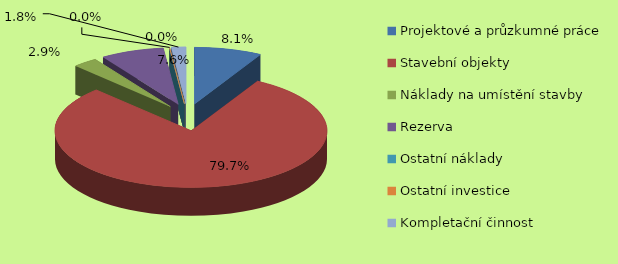
| Category | Series 0 | Series 1 |
|---|---|---|
| Projektové a průzkumné práce | 488926.882 |  |
| Stavební objekty | 4828653.317 |  |
| Náklady na umístění stavby | 178660.173 |  |
| Rezerva | 458722.065 |  |
| Ostatní náklady | 0 |  |
| Ostatní investice | 0 |  |
| Kompletační činnost | 106230.373 |  |